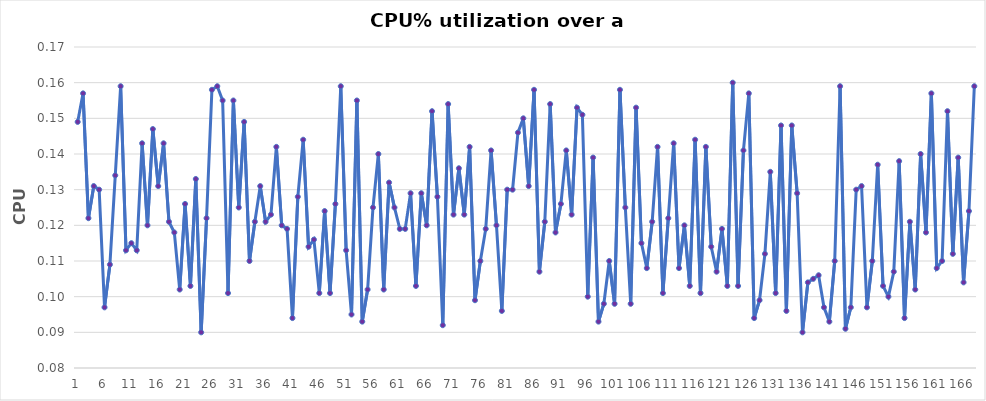
| Category | CPU% utilization |
|---|---|
| 0 | 0.149 |
| 1/1/00 | 0.157 |
| 1/2/00 | 0.122 |
| 1/3/00 | 0.131 |
| 1/4/00 | 0.13 |
| 1/5/00 | 0.097 |
| 1/6/00 | 0.109 |
| 1/7/00 | 0.134 |
| 1/8/00 | 0.159 |
| 1/9/00 | 0.113 |
| 1/10/00 | 0.115 |
| 1/11/00 | 0.113 |
| 1/12/00 | 0.143 |
| 1/13/00 | 0.12 |
| 1/14/00 | 0.147 |
| 1/15/00 | 0.131 |
| 1/16/00 | 0.143 |
| 1/17/00 | 0.121 |
| 1/18/00 | 0.118 |
| 1/19/00 | 0.102 |
| 1/20/00 | 0.126 |
| 1/21/00 | 0.103 |
| 1/22/00 | 0.133 |
| 1/23/00 | 0.09 |
| 1/24/00 | 0.122 |
| 1/25/00 | 0.158 |
| 1/26/00 | 0.159 |
| 1/27/00 | 0.155 |
| 1/28/00 | 0.101 |
| 1/29/00 | 0.155 |
| 1/30/00 | 0.125 |
| 1/31/00 | 0.149 |
| 2/1/00 | 0.11 |
| 2/2/00 | 0.121 |
| 2/3/00 | 0.131 |
| 2/4/00 | 0.121 |
| 2/5/00 | 0.123 |
| 2/6/00 | 0.142 |
| 2/7/00 | 0.12 |
| 2/8/00 | 0.119 |
| 2/9/00 | 0.094 |
| 2/10/00 | 0.128 |
| 2/11/00 | 0.144 |
| 2/12/00 | 0.114 |
| 2/13/00 | 0.116 |
| 2/14/00 | 0.101 |
| 2/15/00 | 0.124 |
| 2/16/00 | 0.101 |
| 2/17/00 | 0.126 |
| 2/18/00 | 0.159 |
| 2/19/00 | 0.113 |
| 2/20/00 | 0.095 |
| 2/21/00 | 0.155 |
| 2/22/00 | 0.093 |
| 2/23/00 | 0.102 |
| 2/24/00 | 0.125 |
| 2/25/00 | 0.14 |
| 2/26/00 | 0.102 |
| 2/27/00 | 0.132 |
| 2/28/00 | 0.125 |
| 2/28/00 | 0.119 |
| 3/1/00 | 0.119 |
| 3/2/00 | 0.129 |
| 3/3/00 | 0.103 |
| 3/4/00 | 0.129 |
| 3/5/00 | 0.12 |
| 3/6/00 | 0.152 |
| 3/7/00 | 0.128 |
| 3/8/00 | 0.092 |
| 3/9/00 | 0.154 |
| 3/10/00 | 0.123 |
| 3/11/00 | 0.136 |
| 3/12/00 | 0.123 |
| 3/13/00 | 0.142 |
| 3/14/00 | 0.099 |
| 3/15/00 | 0.11 |
| 3/16/00 | 0.119 |
| 3/17/00 | 0.141 |
| 3/18/00 | 0.12 |
| 3/19/00 | 0.096 |
| 3/20/00 | 0.13 |
| 3/21/00 | 0.13 |
| 3/22/00 | 0.146 |
| 3/23/00 | 0.15 |
| 3/24/00 | 0.131 |
| 3/25/00 | 0.158 |
| 3/26/00 | 0.107 |
| 3/27/00 | 0.121 |
| 3/28/00 | 0.154 |
| 3/29/00 | 0.118 |
| 3/30/00 | 0.126 |
| 3/31/00 | 0.141 |
| 4/1/00 | 0.123 |
| 4/2/00 | 0.153 |
| 4/3/00 | 0.151 |
| 4/4/00 | 0.1 |
| 4/5/00 | 0.139 |
| 4/6/00 | 0.093 |
| 4/7/00 | 0.098 |
| 4/8/00 | 0.11 |
| 4/9/00 | 0.098 |
| 4/10/00 | 0.158 |
| 4/11/00 | 0.125 |
| 4/12/00 | 0.098 |
| 4/13/00 | 0.153 |
| 4/14/00 | 0.115 |
| 4/15/00 | 0.108 |
| 4/16/00 | 0.121 |
| 4/17/00 | 0.142 |
| 4/18/00 | 0.101 |
| 4/19/00 | 0.122 |
| 4/20/00 | 0.143 |
| 4/21/00 | 0.108 |
| 4/22/00 | 0.12 |
| 4/23/00 | 0.103 |
| 4/24/00 | 0.144 |
| 4/25/00 | 0.101 |
| 4/26/00 | 0.142 |
| 4/27/00 | 0.114 |
| 4/28/00 | 0.107 |
| 4/29/00 | 0.119 |
| 4/30/00 | 0.103 |
| 5/1/00 | 0.16 |
| 5/2/00 | 0.103 |
| 5/3/00 | 0.141 |
| 5/4/00 | 0.157 |
| 5/5/00 | 0.094 |
| 5/6/00 | 0.099 |
| 5/7/00 | 0.112 |
| 5/8/00 | 0.135 |
| 5/9/00 | 0.101 |
| 5/10/00 | 0.148 |
| 5/11/00 | 0.096 |
| 5/12/00 | 0.148 |
| 5/13/00 | 0.129 |
| 5/14/00 | 0.09 |
| 5/15/00 | 0.104 |
| 5/16/00 | 0.105 |
| 5/17/00 | 0.106 |
| 5/18/00 | 0.097 |
| 5/19/00 | 0.093 |
| 5/20/00 | 0.11 |
| 5/21/00 | 0.159 |
| 5/22/00 | 0.091 |
| 5/23/00 | 0.097 |
| 5/24/00 | 0.13 |
| 5/25/00 | 0.131 |
| 5/26/00 | 0.097 |
| 5/27/00 | 0.11 |
| 5/28/00 | 0.137 |
| 5/29/00 | 0.103 |
| 5/30/00 | 0.1 |
| 5/31/00 | 0.107 |
| 6/1/00 | 0.138 |
| 6/2/00 | 0.094 |
| 6/3/00 | 0.121 |
| 6/4/00 | 0.102 |
| 6/5/00 | 0.14 |
| 6/6/00 | 0.118 |
| 6/7/00 | 0.157 |
| 6/8/00 | 0.108 |
| 6/9/00 | 0.11 |
| 6/10/00 | 0.152 |
| 6/11/00 | 0.112 |
| 6/12/00 | 0.139 |
| 6/13/00 | 0.104 |
| 6/14/00 | 0.124 |
| 6/15/00 | 0.159 |